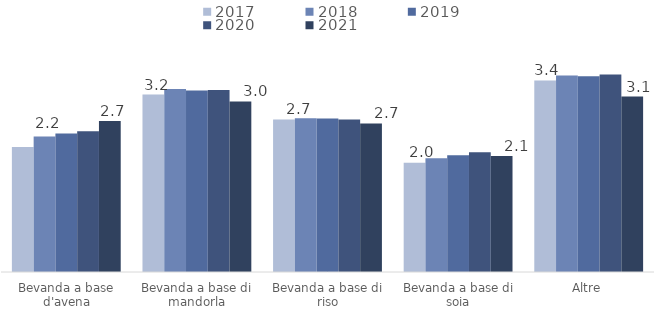
| Category | 2017 | 2018 | 2019 | 2020 | 2021 |
|---|---|---|---|---|---|
| Bevanda a base d'avena | 2.234 | 2.419 | 2.471 | 2.515 | 2.696 |
| Bevanda a base di mandorla | 3.168 | 3.27 | 3.241 | 3.249 | 3.045 |
| Bevanda a base di riso | 2.724 | 2.747 | 2.741 | 2.723 | 2.653 |
| Bevanda a base di soia | 1.952 | 2.03 | 2.085 | 2.138 | 2.071 |
| Altre | 3.42 | 3.509 | 3.498 | 3.526 | 3.133 |